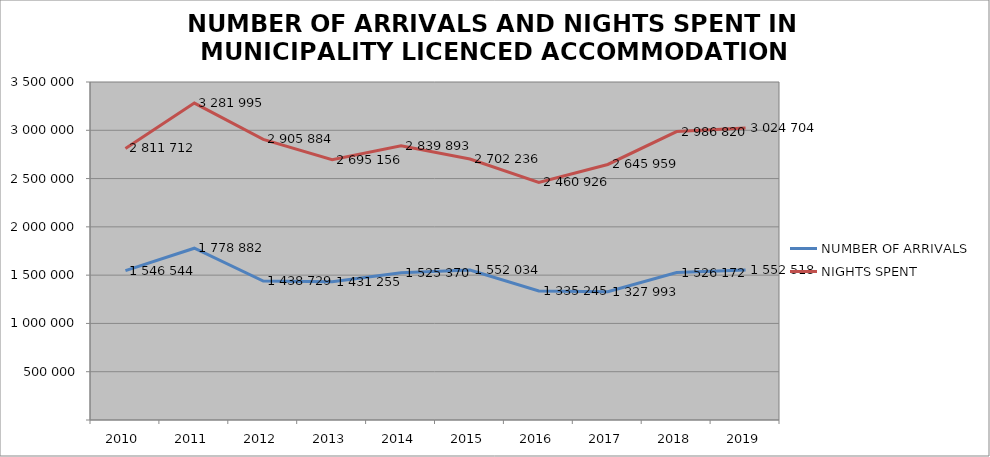
| Category | NUMBER OF ARRIVALS | NIGHTS SPENT |
|---|---|---|
| 2010 | 1546544 | 2811712 |
| 2011 | 1778882 | 3281995 |
| 2012 | 1438729 | 2905884 |
| 2013 | 1431255 | 2695156 |
| 2014 | 1525370 | 2839893 |
| 2015 | 1552034 | 2702236 |
| 2016 | 1335245 | 2460926 |
| 2017 | 1327993 | 2645959 |
| 2018 | 1526172 | 2986820 |
| 2019 | 1552518 | 3024704 |